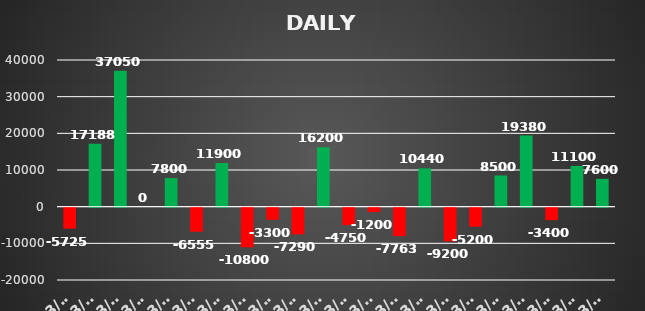
| Category | Series 0 |
|---|---|
| 2022-03-02 | -5725 |
| 2022-03-03 | 17187.5 |
| 2022-03-04 | 37050 |
| 2022-03-07 | 0 |
| 2022-03-08 | 7800 |
| 2022-03-09 | -6555 |
| 2022-03-10 | 11900 |
| 2022-03-11 | -10800 |
| 2022-03-14 | -3300 |
| 2022-03-15 | -7290 |
| 2022-03-16 | 16200 |
| 2022-03-17 | -4750 |
| 2022-03-17 | -1200 |
| 2022-03-21 | -7762.5 |
| 2022-03-22 | 10440 |
| 2022-03-23 | -9200 |
| 2022-03-24 | -5200 |
| 2022-03-25 | 8500 |
| 2022-03-28 | 19380 |
| 2022-03-29 | -3400 |
| 2022-03-30 | 11100 |
| 2022-03-31 | 7600 |